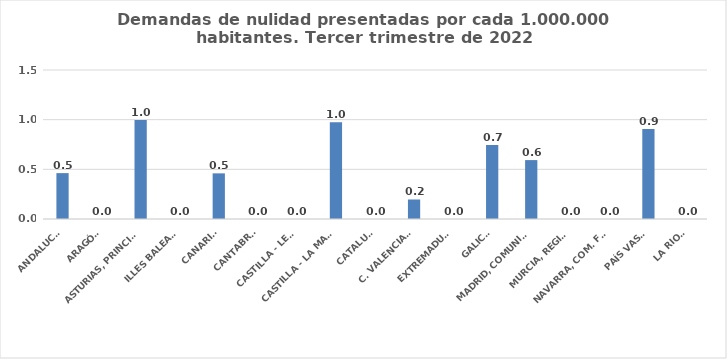
| Category | Series 0 |
|---|---|
| ANDALUCÍA | 0.462 |
| ARAGÓN | 0 |
| ASTURIAS, PRINCIPADO | 0.996 |
| ILLES BALEARS | 0 |
| CANARIAS | 0.459 |
| CANTABRIA | 0 |
| CASTILLA - LEÓN | 0 |
| CASTILLA - LA MANCHA | 0.975 |
| CATALUÑA | 0 |
| C. VALENCIANA | 0.196 |
| EXTREMADURA | 0 |
| GALICIA | 0.744 |
| MADRID, COMUNIDAD | 0.593 |
| MURCIA, REGIÓN | 0 |
| NAVARRA, COM. FORAL | 0 |
| PAÍS VASCO | 0.906 |
| LA RIOJA | 0 |